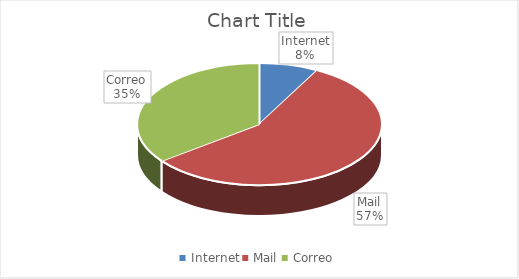
| Category | Series 0 |
|---|---|
| Internet | 4 |
| Mail | 29 |
| Correo | 18 |